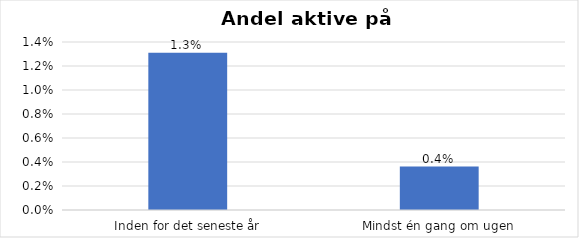
| Category | % |
|---|---|
| Inden for det seneste år | 0.013 |
| Mindst én gang om ugen | 0.004 |